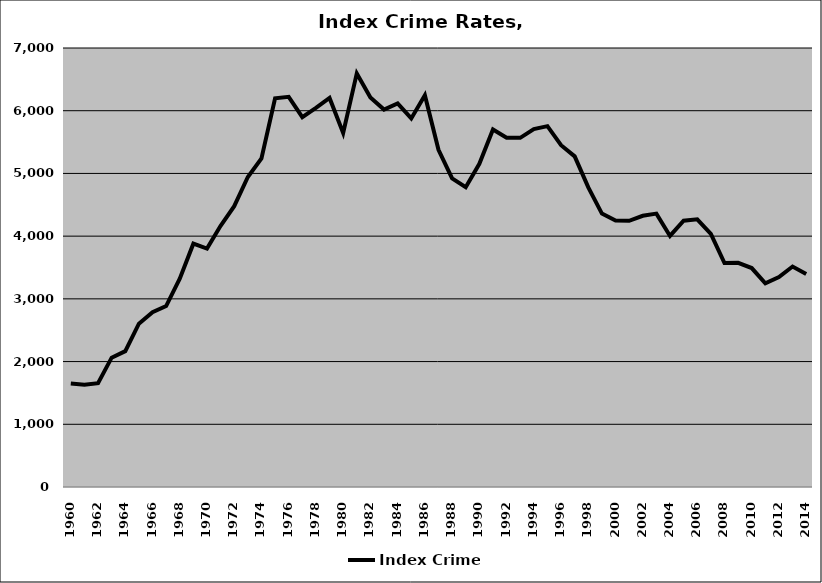
| Category | Index Crime |
|---|---|
| 1960.0 | 1649.224 |
| 1961.0 | 1629.487 |
| 1962.0 | 1656.098 |
| 1963.0 | 2062.5 |
| 1964.0 | 2166 |
| 1965.0 | 2603.557 |
| 1966.0 | 2785.662 |
| 1967.0 | 2884.559 |
| 1968.0 | 3320.939 |
| 1969.0 | 3880.142 |
| 1970.0 | 3801.796 |
| 1971.0 | 4164.537 |
| 1972.0 | 4478.462 |
| 1973.0 | 4943.333 |
| 1974.0 | 5239.763 |
| 1975.0 | 6196.591 |
| 1976.0 | 6220.681 |
| 1977.0 | 5898.034 |
| 1978.0 | 6046.154 |
| 1979.0 | 6203.695 |
| 1980.0 | 5645.678 |
| 1981.0 | 6594.903 |
| 1982.0 | 6212.557 |
| 1983.0 | 6018.58 |
| 1984.0 | 6115.2 |
| 1985.0 | 5876.967 |
| 1986.0 | 6245.88 |
| 1987.0 | 5377.524 |
| 1988.0 | 4921.637 |
| 1989.0 | 4779.886 |
| 1990.0 | 5152.688 |
| 1991.0 | 5701.579 |
| 1992.0 | 5569.506 |
| 1993.0 | 5567.947 |
| 1994.0 | 5708.086 |
| 1995.0 | 5753.808 |
| 1996.0 | 5450.412 |
| 1997.0 | 5272.578 |
| 1998.0 | 4777.036 |
| 1999.0 | 4359.483 |
| 2000.0 | 4249.424 |
| 2001.0 | 4244.591 |
| 2002.0 | 4325.141 |
| 2003.0 | 4359.69 |
| 2004.0 | 4003.162 |
| 2005.0 | 4247.097 |
| 2006.0 | 4268.767 |
| 2007.0 | 4036.267 |
| 2008.0 | 3571.444 |
| 2009.0 | 3573.796 |
| 2010.0 | 3491.258 |
| 2011.0 | 3247.866 |
| 2012.0 | 3347.77 |
| 2013.0 | 3515.725 |
| 2014.0 | 3395.807 |